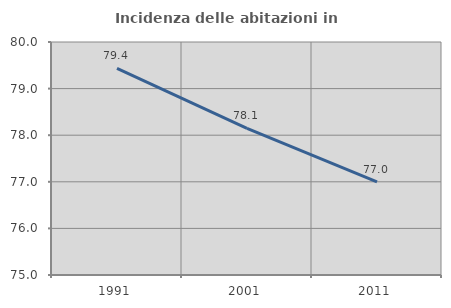
| Category | Incidenza delle abitazioni in proprietà  |
|---|---|
| 1991.0 | 79.434 |
| 2001.0 | 78.147 |
| 2011.0 | 77.001 |